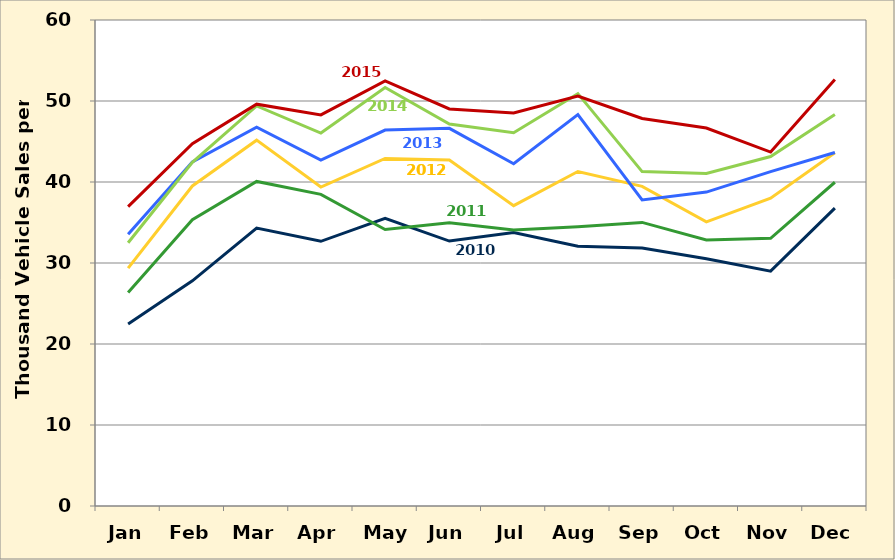
| Category | Series 0 | Series 1 | Series 2 | Series 3 | Series 4 | Series 5 |
|---|---|---|---|---|---|---|
| Jan | 22.469 | 26.349 | 29.361 | 33.557 | 32.507 | 36.965 |
| Feb | 27.801 | 35.353 | 39.511 | 42.485 | 42.43 | 44.731 |
| Mar | 34.31 | 40.073 | 45.166 | 46.757 | 49.394 | 49.607 |
| Apr | 32.68 | 38.474 | 39.374 | 42.712 | 46.04 | 48.278 |
| May | 35.507 | 34.137 | 42.907 | 46.408 | 51.66 | 52.493 |
| Jun | 32.709 | 34.965 | 42.709 | 46.624 | 47.167 | 49.02 |
| Jul | 33.774 | 34.08 | 37.084 | 42.255 | 46.084 | 48.515 |
| Aug | 32.074 | 34.484 | 41.297 | 48.327 | 50.909 | 50.62 |
| Sep | 31.864 | 35.011 | 39.464 | 37.783 | 41.282 | 47.837 |
| Oct | 30.535 | 32.837 | 35.084 | 38.753 | 41.059 | 46.663 |
| Nov | 28.988 | 33.042 | 37.998 | 41.279 | 43.146 | 43.692 |
| Dec | 36.778 | 39.969 | 43.606 | 43.644 | 48.327 | 52.666 |